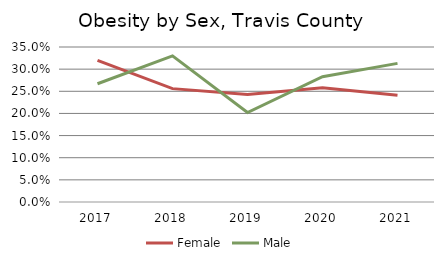
| Category | Female | Male |
|---|---|---|
| 2017.0 | 0.32 | 0.267 |
| 2018.0 | 0.256 | 0.33 |
| 2019.0 | 0.243 | 0.202 |
| 2020.0 | 0.258 | 0.283 |
| 2021.0 | 0.241 | 0.313 |